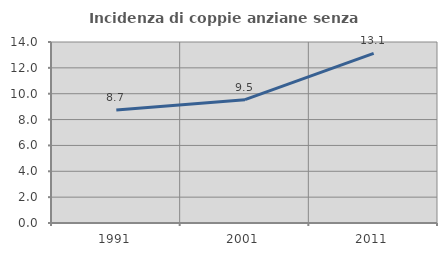
| Category | Incidenza di coppie anziane senza figli  |
|---|---|
| 1991.0 | 8.745 |
| 2001.0 | 9.541 |
| 2011.0 | 13.126 |